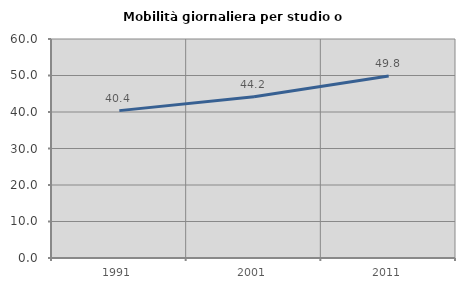
| Category | Mobilità giornaliera per studio o lavoro |
|---|---|
| 1991.0 | 40.375 |
| 2001.0 | 44.167 |
| 2011.0 | 49.84 |